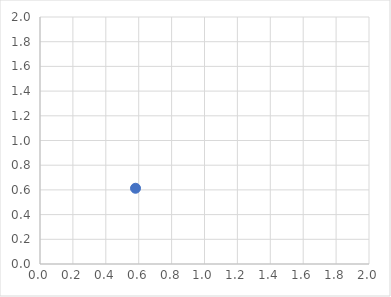
| Category | Series 0 |
|---|---|
| 0.5806399067553387 | 0.613 |